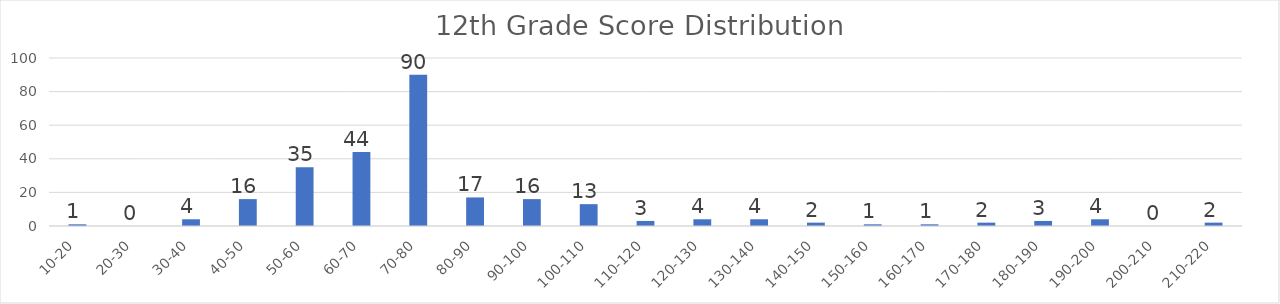
| Category | Series 0 |
|---|---|
| 10-20 | 1 |
| 20-30 | 0 |
| 30-40 | 4 |
| 40-50 | 16 |
| 50-60 | 35 |
| 60-70 | 44 |
| 70-80 | 90 |
| 80-90 | 17 |
| 90-100 | 16 |
| 100-110 | 13 |
| 110-120 | 3 |
| 120-130 | 4 |
| 130-140 | 4 |
| 140-150 | 2 |
| 150-160 | 1 |
| 160-170 | 1 |
| 170-180 | 2 |
| 180-190 | 3 |
| 190-200 | 4 |
| 200-210 | 0 |
| 210-220 | 2 |